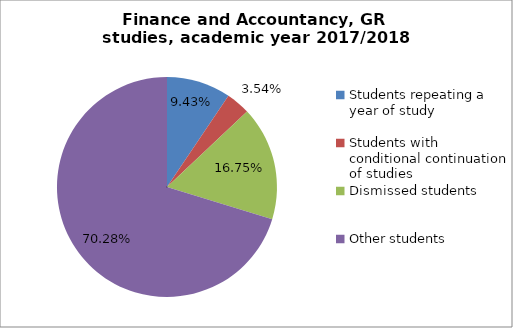
| Category | Series 0 |
|---|---|
| Students repeating a year of study | 40 |
| Students with conditional continuation of studies | 15 |
| Dismissed students | 71 |
| Other students | 298 |